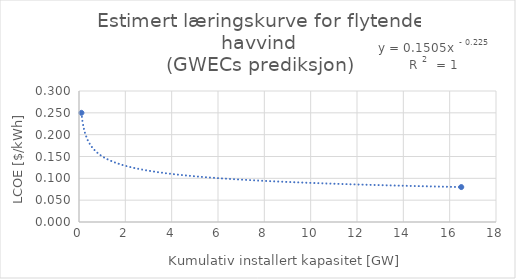
| Category | y |
|---|---|
| 0.105 | 0.25 |
| 16.5 | 0.08 |